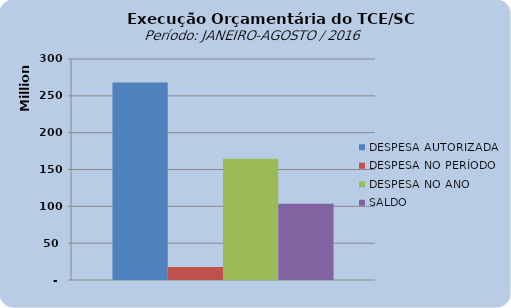
| Category | DESPESA AUTORIZADA | DESPESA NO PERÍODO | DESPESA NO ANO | SALDO |
|---|---|---|---|---|
| 0 | 268048627.5 | 17514156.54 | 164663541.99 | 103385079.65 |